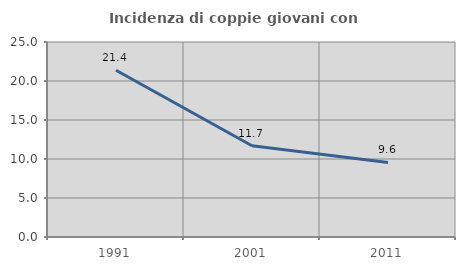
| Category | Incidenza di coppie giovani con figli |
|---|---|
| 1991.0 | 21.374 |
| 2001.0 | 11.697 |
| 2011.0 | 9.559 |